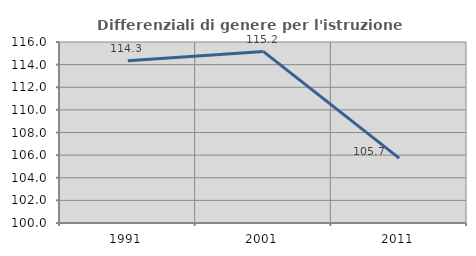
| Category | Differenziali di genere per l'istruzione superiore |
|---|---|
| 1991.0 | 114.349 |
| 2001.0 | 115.153 |
| 2011.0 | 105.736 |